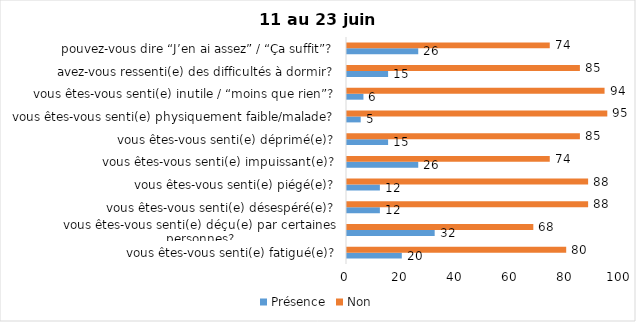
| Category | Présence | Non |
|---|---|---|
| vous êtes-vous senti(e) fatigué(e)? | 20 | 80 |
| vous êtes-vous senti(e) déçu(e) par certaines personnes? | 32 | 68 |
| vous êtes-vous senti(e) désespéré(e)? | 12 | 88 |
| vous êtes-vous senti(e) piégé(e)? | 12 | 88 |
| vous êtes-vous senti(e) impuissant(e)? | 26 | 74 |
| vous êtes-vous senti(e) déprimé(e)? | 15 | 85 |
| vous êtes-vous senti(e) physiquement faible/malade? | 5 | 95 |
| vous êtes-vous senti(e) inutile / “moins que rien”? | 6 | 94 |
| avez-vous ressenti(e) des difficultés à dormir? | 15 | 85 |
| pouvez-vous dire “J’en ai assez” / “Ça suffit”? | 26 | 74 |